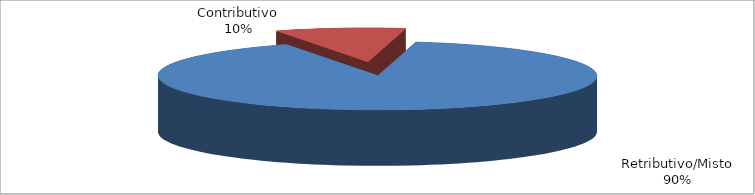
| Category | Series 1 |
|---|---|
| Retributivo/Misto | 327497 |
| Contributivo | 34765 |